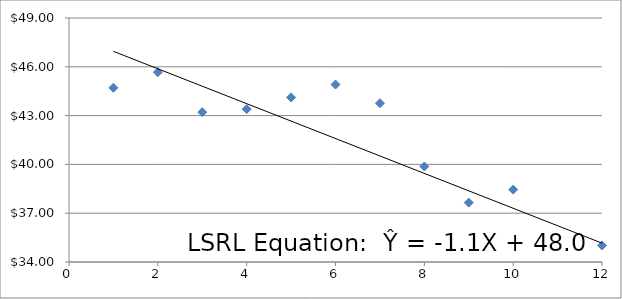
| Category | Series 0 |
|---|---|
| 1.0 | 44.71 |
| 2.0 | 45.67 |
| 3.0 | 43.21 |
| 4.0 | 43.4 |
| 5.0 | 44.12 |
| 6.0 | 44.91 |
| 7.0 | 43.76 |
| 8.0 | 39.87 |
| 9.0 | 37.65 |
| 10.0 | 38.45 |
| 11.0 | 31.89 |
| 12.0 | 35.02 |